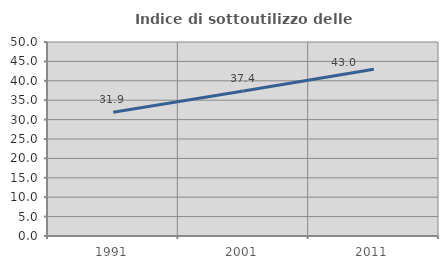
| Category | Indice di sottoutilizzo delle abitazioni  |
|---|---|
| 1991.0 | 31.888 |
| 2001.0 | 37.366 |
| 2011.0 | 42.974 |